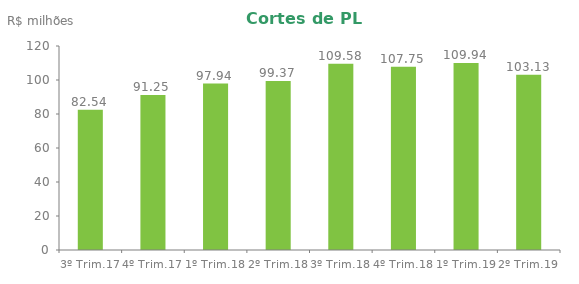
| Category | Series 0 |
|---|---|
| 3º Trim.17 | 82.54 |
| 4º Trim.17 | 91.247 |
| 1º Trim.18 | 97.937 |
| 2º Trim.18 | 99.374 |
| 3º Trim.18 | 109.58 |
| 4º Trim.18 | 107.752 |
| 1º Trim.19 | 109.94 |
| 2º Trim.19 | 103.131 |